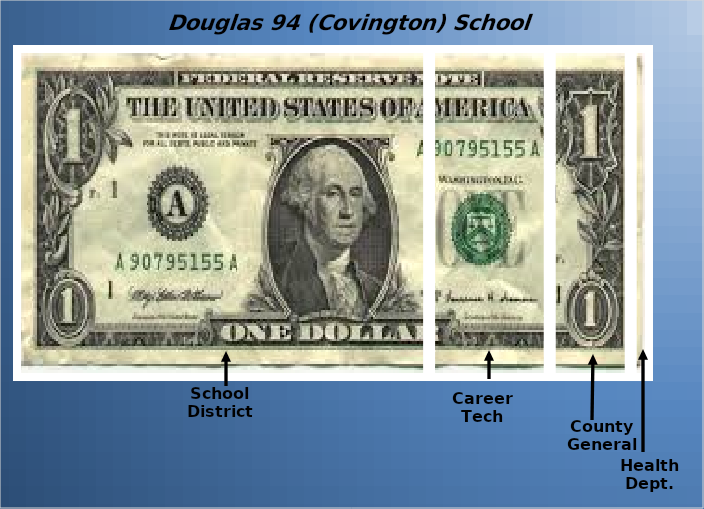
| Category | School District | Career Tech | County General | Health Dept. |
|---|---|---|---|---|
| 0 | 0.651 | 0.19 | 0.127 | 0.032 |